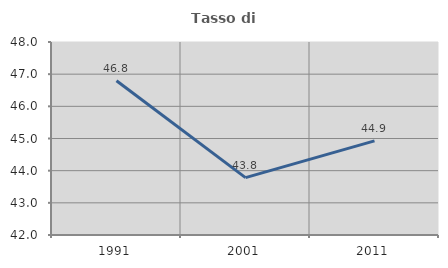
| Category | Tasso di occupazione   |
|---|---|
| 1991.0 | 46.797 |
| 2001.0 | 43.784 |
| 2011.0 | 44.926 |